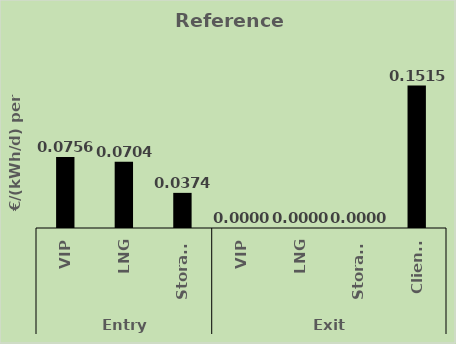
| Category | Series 0 |
|---|---|
| 0 | 0.076 |
| 1 | 0.07 |
| 2 | 0.037 |
| 3 | 0 |
| 4 | 0 |
| 5 | 0 |
| 6 | 0.152 |